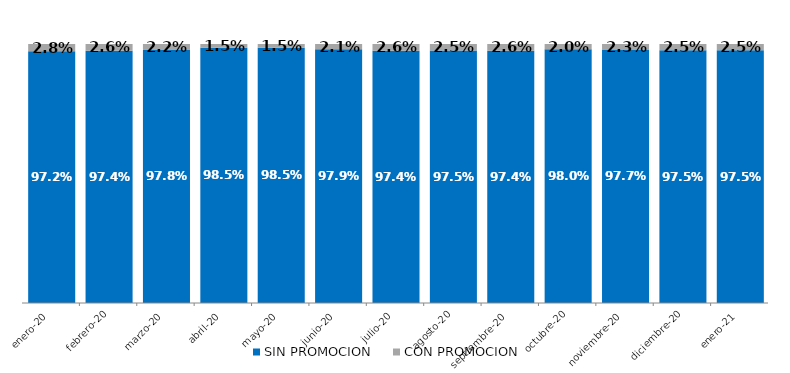
| Category | SIN PROMOCION   | CON PROMOCION   |
|---|---|---|
| 2020-01-01 | 0.972 | 0.028 |
| 2020-02-01 | 0.974 | 0.026 |
| 2020-03-01 | 0.978 | 0.022 |
| 2020-04-01 | 0.985 | 0.015 |
| 2020-05-01 | 0.985 | 0.015 |
| 2020-06-01 | 0.979 | 0.021 |
| 2020-07-01 | 0.974 | 0.026 |
| 2020-08-01 | 0.975 | 0.025 |
| 2020-09-01 | 0.974 | 0.026 |
| 2020-10-01 | 0.98 | 0.02 |
| 2020-11-01 | 0.977 | 0.023 |
| 2020-12-01 | 0.975 | 0.025 |
| 2021-01-01 | 0.975 | 0.025 |